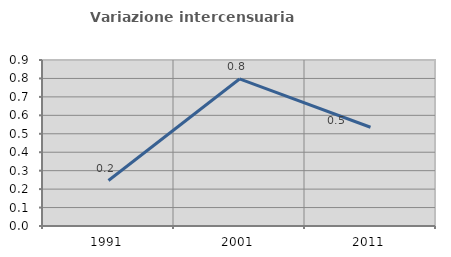
| Category | Variazione intercensuaria annua |
|---|---|
| 1991.0 | 0.246 |
| 2001.0 | 0.797 |
| 2011.0 | 0.535 |